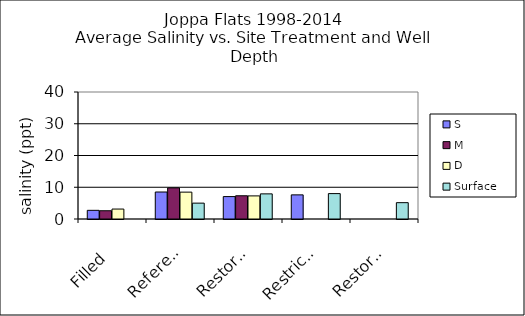
| Category | S | M | D | Surface |
|---|---|---|---|---|
| Filled | 2.727 | 2.6 | 3.133 | 0 |
| Reference | 8.5 | 9.808 | 8.462 | 5 |
| Restored 2 | 7.058 | 7.318 | 7.277 | 7.915 |
| Restricted | 7.6 | 0 | 0 | 8 |
| Restored 1 | 0 | 0 | 0 | 5.143 |